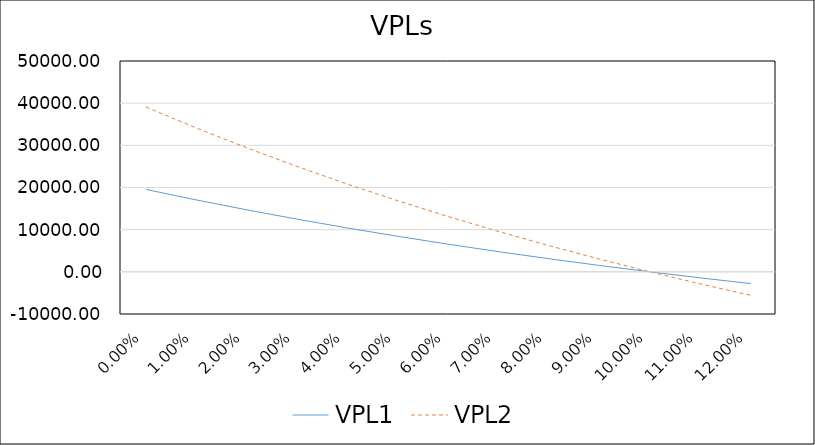
| Category | VPL1 | VPL2 |
|---|---|---|
| 0.0 | 19530 | 39060 |
| 0.01 | 17042.944 | 34085.888 |
| 0.02 | 14697.123 | 29394.247 |
| 0.03 | 12482.875 | 24965.751 |
| 0.04 | 10391.297 | 20782.593 |
| 0.05 | 8414.178 | 16828.356 |
| 0.06 | 6543.943 | 13087.886 |
| 0.07 | 4773.593 | 9547.186 |
| 0.08 | 3096.658 | 6193.316 |
| 0.09 | 1507.153 | 3014.305 |
| 0.1 | -0.467 | -0.934 |
| 0.11 | -1431.337 | -2862.673 |
| 0.12 | -2790.221 | -5580.442 |